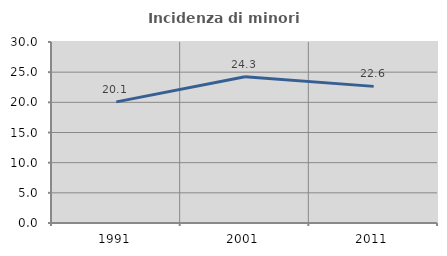
| Category | Incidenza di minori stranieri |
|---|---|
| 1991.0 | 20.074 |
| 2001.0 | 24.253 |
| 2011.0 | 22.645 |